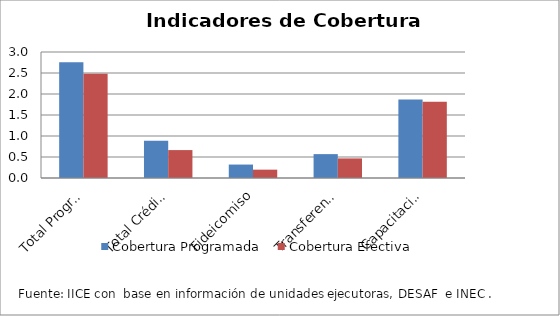
| Category | Cobertura Programada | Cobertura Efectiva |
|---|---|---|
| Total Programa | 2.756 | 2.481 |
| Total Crédito | 0.889 | 0.665 |
| Fideicomiso | 0.32 | 0.198 |
| Transferencia | 0.569 | 0.466 |
| Capacitación | 1.867 | 1.817 |